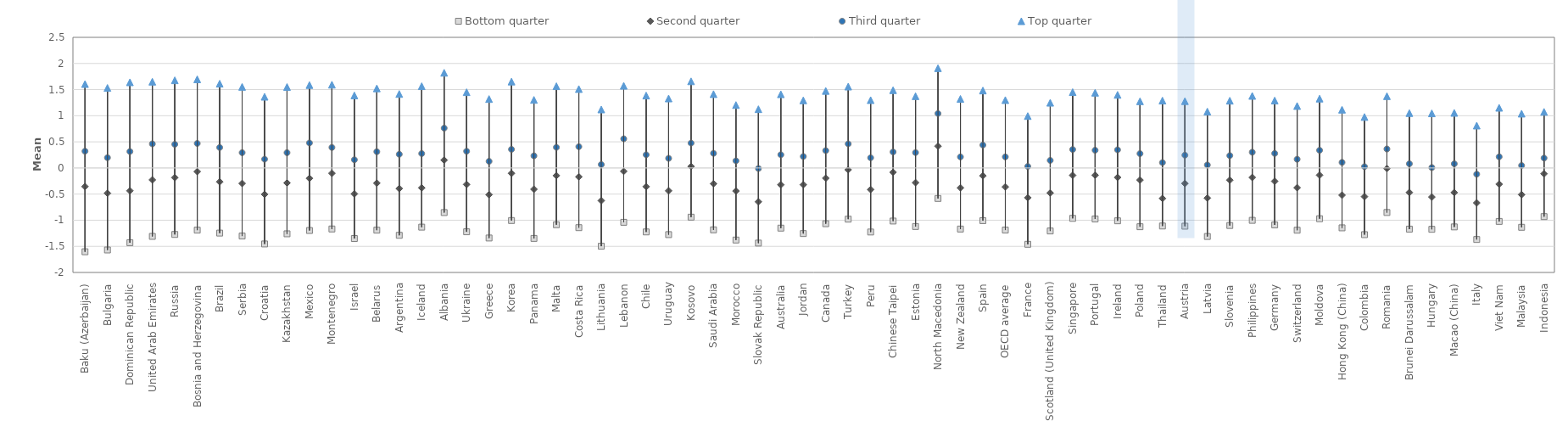
| Category | Bottom quarter | Second quarter | Third quarter | Top quarter  |
|---|---|---|---|---|
| Baku (Azerbaijan) | -1.604 | -0.356 | 0.321 | 1.606 |
| Bulgaria | -1.57 | -0.483 | 0.197 | 1.532 |
| Dominican Republic | -1.431 | -0.436 | 0.315 | 1.64 |
| United Arab Emirates | -1.31 | -0.228 | 0.461 | 1.651 |
| Russia | -1.273 | -0.185 | 0.453 | 1.678 |
| Bosnia and Herzegovina | -1.19 | -0.069 | 0.469 | 1.697 |
| Brazil | -1.246 | -0.265 | 0.392 | 1.613 |
| Serbia | -1.303 | -0.296 | 0.293 | 1.552 |
| Croatia | -1.454 | -0.504 | 0.168 | 1.363 |
| Kazakhstan | -1.26 | -0.286 | 0.292 | 1.55 |
| Mexico | -1.197 | -0.199 | 0.479 | 1.587 |
| Montenegro | -1.168 | -0.102 | 0.392 | 1.593 |
| Israel | -1.35 | -0.496 | 0.157 | 1.388 |
| Belarus | -1.19 | -0.291 | 0.311 | 1.523 |
| Argentina | -1.289 | -0.394 | 0.262 | 1.416 |
| Iceland | -1.133 | -0.38 | 0.276 | 1.565 |
| Albania | -0.853 | 0.151 | 0.763 | 1.822 |
| Ukraine | -1.221 | -0.316 | 0.32 | 1.45 |
| Greece | -1.341 | -0.511 | 0.127 | 1.32 |
| Korea | -1.006 | -0.103 | 0.356 | 1.653 |
| Panama | -1.348 | -0.407 | 0.232 | 1.303 |
| Malta | -1.087 | -0.146 | 0.395 | 1.565 |
| Costa Rica | -1.142 | -0.169 | 0.407 | 1.51 |
| Lithuania | -1.498 | -0.626 | 0.066 | 1.12 |
| Lebanon | -1.04 | -0.064 | 0.558 | 1.573 |
| Chile | -1.224 | -0.356 | 0.252 | 1.386 |
| Uruguay | -1.276 | -0.438 | 0.184 | 1.33 |
| Kosovo | -0.941 | 0.029 | 0.476 | 1.658 |
| Saudi Arabia | -1.184 | -0.302 | 0.28 | 1.413 |
| Morocco | -1.379 | -0.442 | 0.137 | 1.204 |
| Slovak Republic | -1.438 | -0.648 | -0.01 | 1.125 |
| Australia | -1.151 | -0.321 | 0.253 | 1.41 |
| Jordan | -1.255 | -0.32 | 0.22 | 1.294 |
| Canada | -1.067 | -0.196 | 0.333 | 1.474 |
| Turkey | -0.979 | -0.034 | 0.461 | 1.557 |
| Peru | -1.226 | -0.413 | 0.195 | 1.298 |
| Chinese Taipei | -1.016 | -0.082 | 0.306 | 1.488 |
| Estonia | -1.12 | -0.28 | 0.294 | 1.373 |
| North Macedonia | -0.584 | 0.416 | 1.042 | 1.91 |
| New Zealand | -1.169 | -0.38 | 0.211 | 1.322 |
| Spain | -1.008 | -0.15 | 0.439 | 1.482 |
| OECD average | -1.188 | -0.363 | 0.212 | 1.299 |
| France | -1.461 | -0.569 | 0.029 | 0.994 |
| Scotland (United Kingdom) | -1.206 | -0.478 | 0.145 | 1.248 |
| Singapore | -0.964 | -0.141 | 0.353 | 1.452 |
| Portugal | -0.976 | -0.139 | 0.339 | 1.44 |
| Ireland | -1.011 | -0.181 | 0.347 | 1.399 |
| Poland | -1.125 | -0.231 | 0.275 | 1.276 |
| Thailand | -1.111 | -0.583 | 0.103 | 1.29 |
| Austria | -1.114 | -0.296 | 0.245 | 1.279 |
| Latvia | -1.312 | -0.576 | 0.057 | 1.079 |
| Slovenia | -1.101 | -0.233 | 0.236 | 1.288 |
| Philippines | -1.003 | -0.182 | 0.301 | 1.379 |
| Germany | -1.089 | -0.255 | 0.279 | 1.291 |
| Switzerland | -1.191 | -0.378 | 0.166 | 1.186 |
| Moldova | -0.971 | -0.138 | 0.338 | 1.327 |
| Hong Kong (China) | -1.146 | -0.521 | 0.107 | 1.115 |
| Colombia | -1.276 | -0.548 | 0.025 | 0.976 |
| Romania | -0.852 | -0.012 | 0.363 | 1.374 |
| Brunei Darussalam | -1.17 | -0.469 | 0.08 | 1.05 |
| Hungary | -1.174 | -0.556 | 0.008 | 1.045 |
| Macao (China) | -1.128 | -0.47 | 0.08 | 1.054 |
| Italy | -1.369 | -0.668 | -0.119 | 0.811 |
| Viet Nam | -1.023 | -0.31 | 0.214 | 1.152 |
| Malaysia | -1.136 | -0.511 | 0.047 | 1.039 |
| Indonesia | -0.931 | -0.111 | 0.189 | 1.074 |